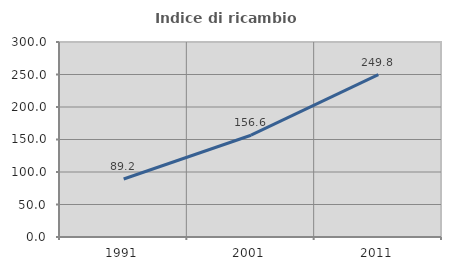
| Category | Indice di ricambio occupazionale  |
|---|---|
| 1991.0 | 89.246 |
| 2001.0 | 156.594 |
| 2011.0 | 249.757 |